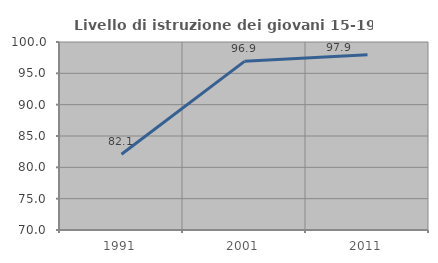
| Category | Livello di istruzione dei giovani 15-19 anni |
|---|---|
| 1991.0 | 82.095 |
| 2001.0 | 96.916 |
| 2011.0 | 97.946 |